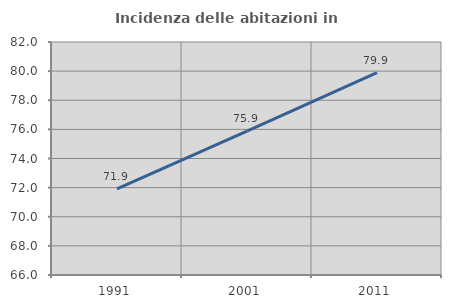
| Category | Incidenza delle abitazioni in proprietà  |
|---|---|
| 1991.0 | 71.908 |
| 2001.0 | 75.88 |
| 2011.0 | 79.89 |